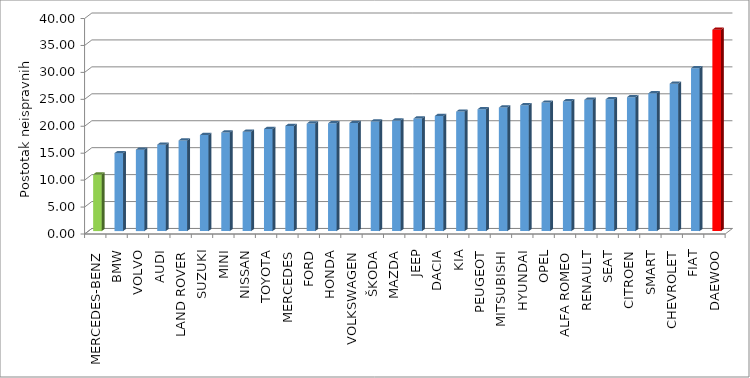
| Category | Series 4 |
|---|---|
| MERCEDES-BENZ | 10.511 |
| BMW | 14.473 |
| VOLVO | 15.118 |
| AUDI | 16.043 |
| LAND ROVER | 16.827 |
| SUZUKI | 17.833 |
| MINI | 18.318 |
| NISSAN | 18.435 |
| TOYOTA | 18.965 |
| MERCEDES | 19.531 |
| FORD | 19.962 |
| HONDA | 20.013 |
| VOLKSWAGEN | 20.068 |
| ŠKODA | 20.363 |
| MAZDA | 20.554 |
| JEEP | 20.891 |
| DACIA | 21.367 |
| KIA | 22.183 |
| PEUGEOT | 22.619 |
| MITSUBISHI | 22.936 |
| HYUNDAI | 23.368 |
| OPEL | 23.858 |
| ALFA ROMEO | 24.109 |
| RENAULT | 24.369 |
| SEAT | 24.467 |
| CITROEN | 24.871 |
| SMART | 25.582 |
| CHEVROLET | 27.376 |
| FIAT | 30.249 |
| DAEWOO | 37.397 |